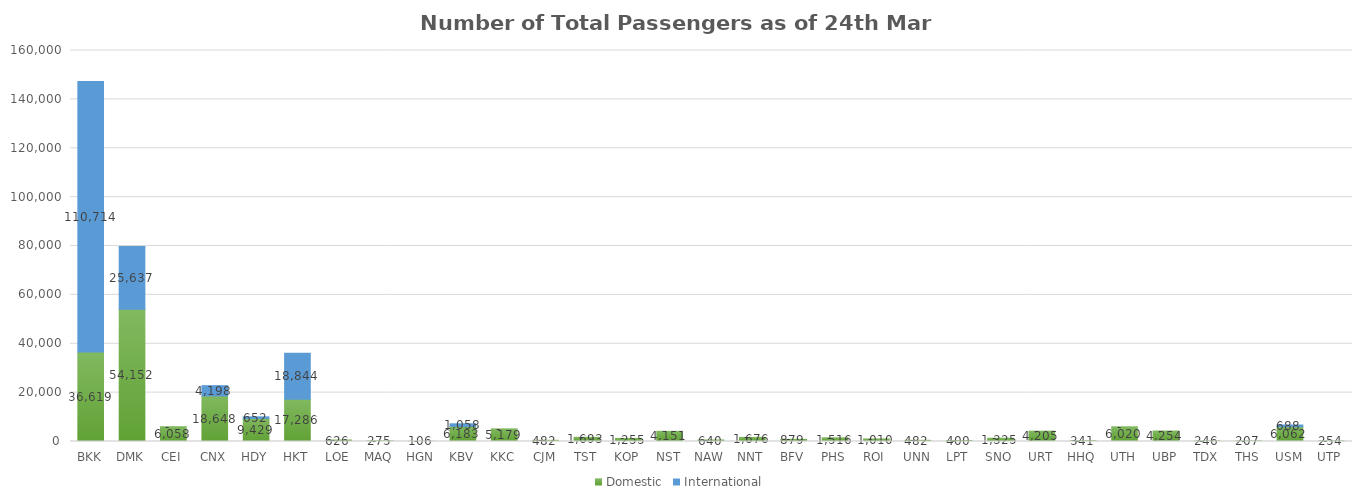
| Category | Domestic | International |
|---|---|---|
| BKK | 36619 | 110714 |
| DMK | 54152 | 25637 |
| CEI | 6058 | 0 |
| CNX | 18648 | 4198 |
| HDY | 9429 | 652 |
| HKT | 17286 | 18844 |
| LOE | 626 | 0 |
| MAQ | 275 | 0 |
| HGN | 106 | 0 |
| KBV | 6183 | 1058 |
| KKC | 5179 | 0 |
| CJM | 482 | 0 |
| TST | 1693 | 0 |
| KOP | 1255 | 0 |
| NST | 4151 | 0 |
| NAW | 640 | 0 |
| NNT | 1676 | 0 |
| BFV | 879 | 0 |
| PHS | 1516 | 0 |
| ROI | 1010 | 0 |
| UNN | 482 | 0 |
| LPT | 400 | 0 |
| SNO | 1325 | 0 |
| URT | 4205 | 0 |
| HHQ | 341 | 0 |
| UTH | 6020 | 0 |
| UBP | 4254 | 0 |
| TDX | 246 | 0 |
| THS | 207 | 0 |
| USM | 6062 | 688 |
| UTP | 254 | 0 |